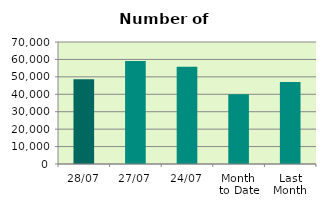
| Category | Series 0 |
|---|---|
| 28/07 | 48652 |
| 27/07 | 59072 |
| 24/07 | 55760 |
| Month 
to Date | 40074.4 |
| Last
Month | 46980.273 |